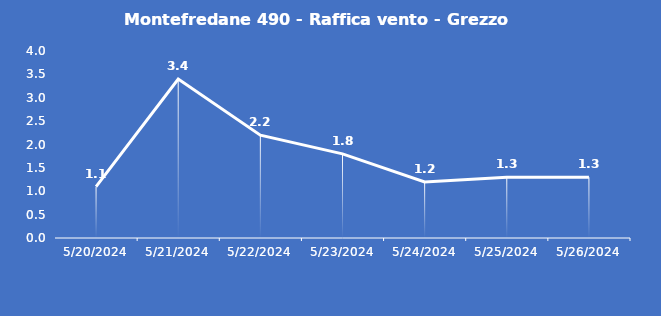
| Category | Montefredane 490 - Raffica vento - Grezzo (m/s) |
|---|---|
| 5/20/24 | 1.1 |
| 5/21/24 | 3.4 |
| 5/22/24 | 2.2 |
| 5/23/24 | 1.8 |
| 5/24/24 | 1.2 |
| 5/25/24 | 1.3 |
| 5/26/24 | 1.3 |